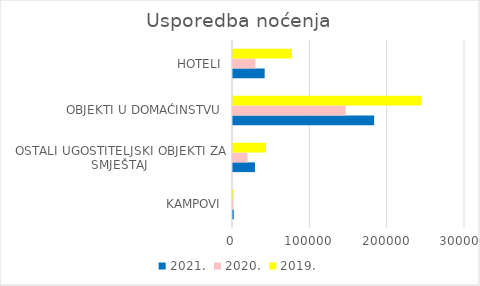
| Category | 2021. | 2020. | 2019. |
|---|---|---|---|
| KAMPOVI | 987 | 914 | 961 |
| OSTALI UGOSTITELJSKI OBJEKTI ZA SMJEŠTAJ | 28402 | 18713 | 42655 |
| OBJEKTI U DOMAĆINSTVU | 182491 | 145560 | 243284 |
| HOTELI | 40959 | 29021 | 76254 |